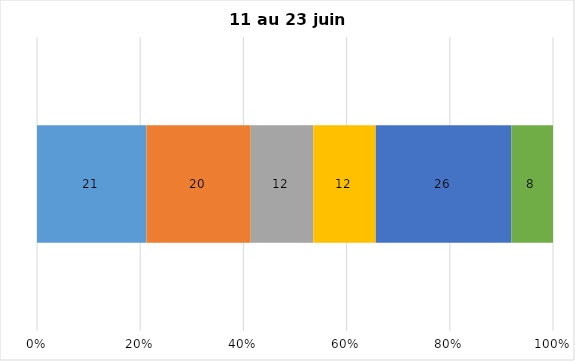
| Category | Plusieurs fois par jour | Une fois par jour | Quelques fois par semaine   | Une fois par semaine ou moins   |  Jamais   |  Je n’utilise pas les médias sociaux |
|---|---|---|---|---|---|---|
| 0 | 21 | 20 | 12 | 12 | 26 | 8 |